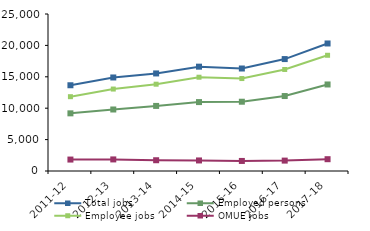
| Category | Total jobs | Employed persons | Employee jobs | OMUE jobs |
|---|---|---|---|---|
| 2011-12 | 13654 | 9181 | 11834 | 1822 |
| 2012-13 | 14893 | 9794 | 13049 | 1844 |
| 2013-14 | 15535 | 10363 | 13822 | 1714 |
| 2014-15 | 16614 | 10974 | 14933 | 1680 |
| 2015-16 | 16321 | 11031 | 14721 | 1601 |
| 2016-17 | 17822 | 11937 | 16167 | 1655 |
| 2017-18 | 20307 | 13778 | 18428 | 1880 |